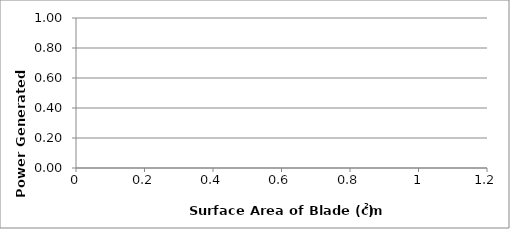
| Category | Power vs. Surface Area |
|---|---|
|  | 0 |
|  | 0 |
|  | 0 |
|  | 0 |
|  | 0 |
|  | 0 |
|  | 0 |
|  | 0 |
|  | 0 |
|  | 0 |
|  | 0 |
|  | 0 |
|  | 0 |
|  | 0 |
|  | 0 |
|  | 0 |
|  | 0 |
|  | 0 |
|  | 0 |
|  | 0 |
|  | 0 |
|  | 0 |
|  | 0 |
|  | 0 |